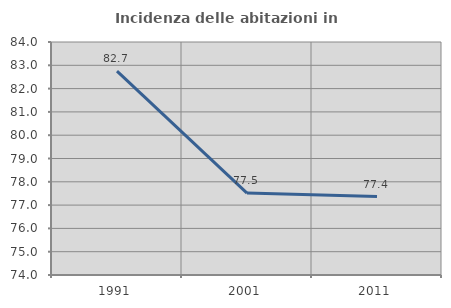
| Category | Incidenza delle abitazioni in proprietà  |
|---|---|
| 1991.0 | 82.749 |
| 2001.0 | 77.515 |
| 2011.0 | 77.364 |